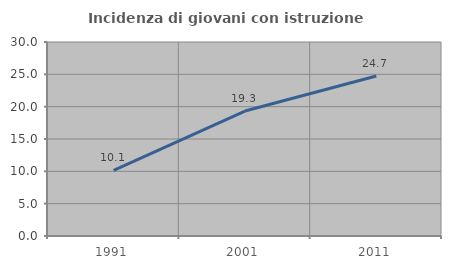
| Category | Incidenza di giovani con istruzione universitaria |
|---|---|
| 1991.0 | 10.14 |
| 2001.0 | 19.322 |
| 2011.0 | 24.731 |